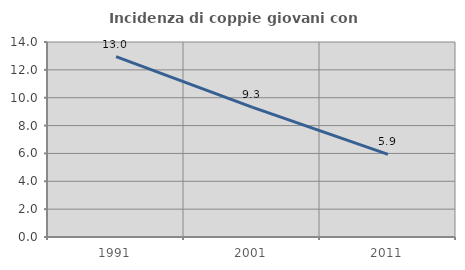
| Category | Incidenza di coppie giovani con figli |
|---|---|
| 1991.0 | 12.952 |
| 2001.0 | 9.329 |
| 2011.0 | 5.93 |